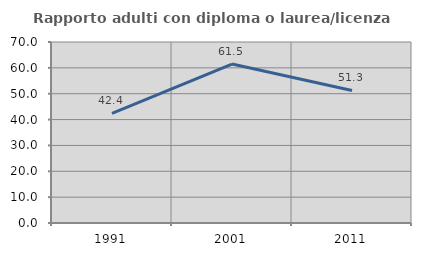
| Category | Rapporto adulti con diploma o laurea/licenza media  |
|---|---|
| 1991.0 | 42.391 |
| 2001.0 | 61.475 |
| 2011.0 | 51.266 |